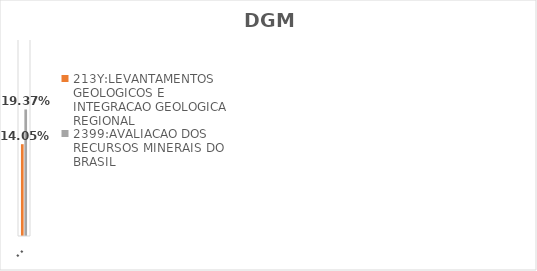
| Category | 213Y:LEVANTAMENTOS GEOLOGICOS E INTEGRACAO GEOLOGICA REGIONAL | 2399:AVALIACAO DOS RECURSOS MINERAIS DO BRASIL |
|---|---|---|
| EXECUTADO | 0.141 | 0.194 |